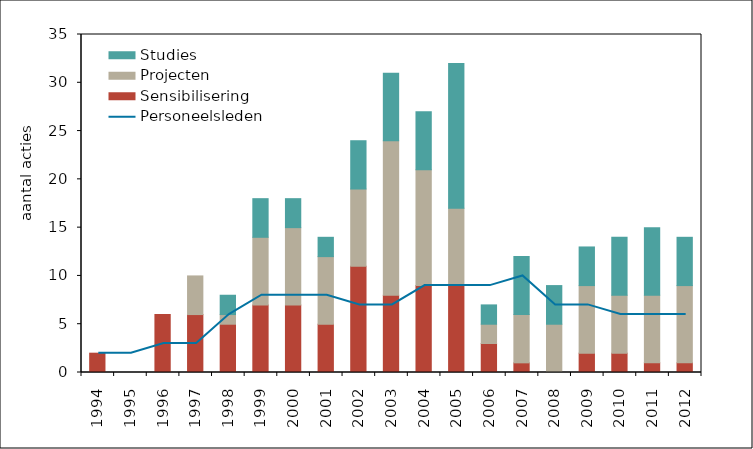
| Category | Sensibilisering | Projecten | Studies |
|---|---|---|---|
| 1994.0 | 2 | 0 | 0 |
| 1995.0 | 0 | 0 | 0 |
| 1996.0 | 6 | 0 | 0 |
| 1997.0 | 6 | 4 | 0 |
| 1998.0 | 5 | 1 | 2 |
| 1999.0 | 7 | 7 | 4 |
| 2000.0 | 7 | 8 | 3 |
| 2001.0 | 5 | 7 | 2 |
| 2002.0 | 11 | 8 | 5 |
| 2003.0 | 8 | 16 | 7 |
| 2004.0 | 9 | 12 | 6 |
| 2005.0 | 9 | 8 | 15 |
| 2006.0 | 3 | 2 | 2 |
| 2007.0 | 1 | 5 | 6 |
| 2008.0 | 0 | 5 | 4 |
| 2009.0 | 2 | 7 | 4 |
| 2010.0 | 2 | 6 | 6 |
| 2011.0 | 1 | 7 | 7 |
| 2012.0 | 1 | 8 | 5 |